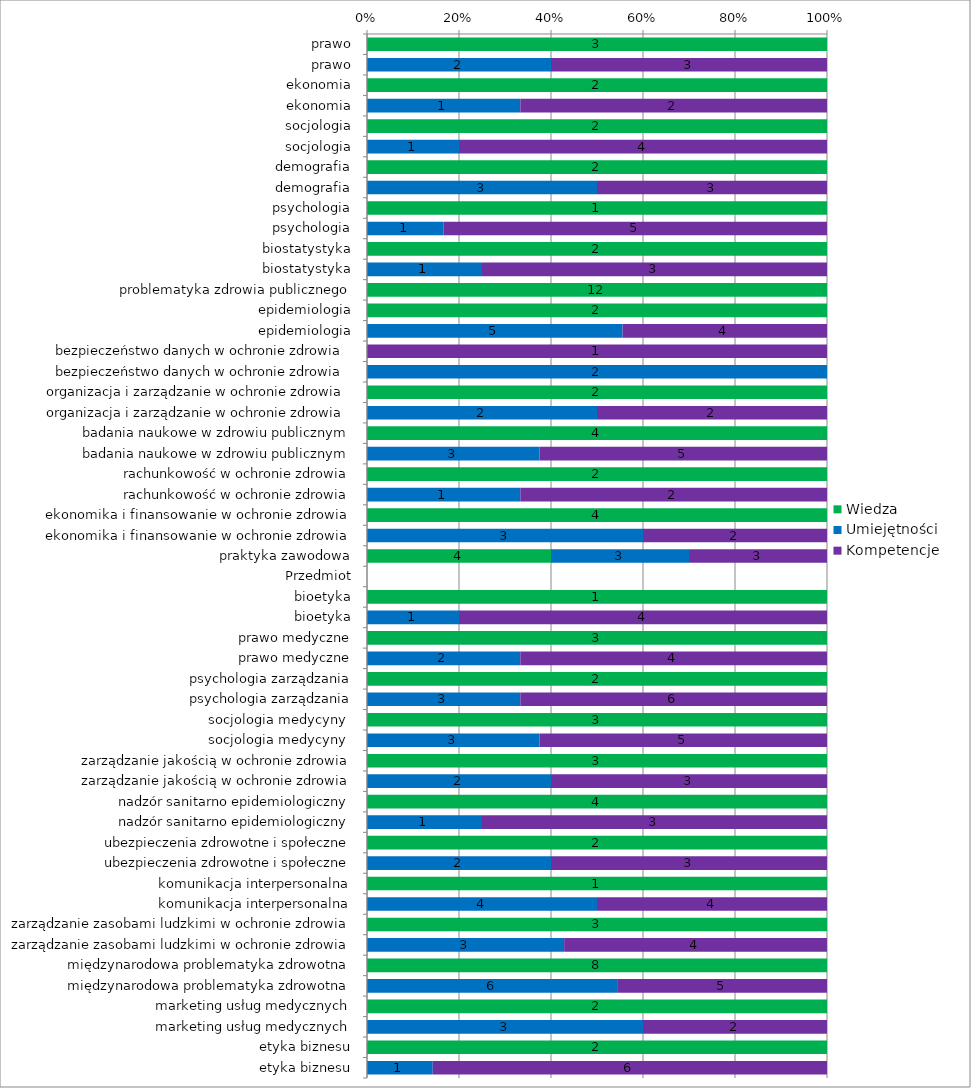
| Category | Wiedza | Umiejętności | Kompetencje |
|---|---|---|---|
|  prawo | 3 | 0 | 0 |
|  prawo | 0 | 2 | 3 |
|  ekonomia | 2 | 0 | 0 |
|  ekonomia | 0 | 1 | 2 |
|  socjologia | 2 | 0 | 0 |
|  socjologia | 0 | 1 | 4 |
|  demografia | 2 | 0 | 0 |
|  demografia | 0 | 3 | 3 |
|  psychologia | 1 | 0 | 0 |
|  psychologia | 0 | 1 | 5 |
|  biostatystyka | 2 | 0 | 0 |
|  biostatystyka | 0 | 1 | 3 |
| problematyka zdrowia publicznego | 12 | 0 | 0 |
| epidemiologia | 2 | 0 | 0 |
| epidemiologia | 0 | 5 | 4 |
| bezpieczeństwo danych w ochronie zdrowia  | 0 | 0 | 1 |
| bezpieczeństwo danych w ochronie zdrowia  | 0 | 2 | 0 |
| organizacja i zarządzanie w ochronie zdrowia  | 2 | 0 | 0 |
| organizacja i zarządzanie w ochronie zdrowia  | 0 | 2 | 2 |
| badania naukowe w zdrowiu publicznym | 4 | 0 | 0 |
| badania naukowe w zdrowiu publicznym | 0 | 3 | 5 |
| rachunkowość w ochronie zdrowia | 2 | 0 | 0 |
| rachunkowość w ochronie zdrowia | 0 | 1 | 2 |
| ekonomika i finansowanie w ochronie zdrowia | 4 | 0 | 0 |
| ekonomika i finansowanie w ochronie zdrowia | 0 | 3 | 2 |
| praktyka zawodowa | 4 | 3 | 3 |
| Przedmiot | 0 | 0 | 0 |
| bioetyka | 1 | 0 | 0 |
| bioetyka | 0 | 1 | 4 |
| prawo medyczne | 3 | 0 | 0 |
| prawo medyczne | 0 | 2 | 4 |
| psychologia zarządzania | 2 | 0 | 0 |
| psychologia zarządzania | 0 | 3 | 6 |
| socjologia medycyny  | 3 | 0 | 0 |
| socjologia medycyny  | 0 | 3 | 5 |
| zarządzanie jakością w ochronie zdrowia | 3 | 0 | 0 |
| zarządzanie jakością w ochronie zdrowia | 0 | 2 | 3 |
| nadzór sanitarno epidemiologiczny | 4 | 0 | 0 |
| nadzór sanitarno epidemiologiczny | 0 | 1 | 3 |
| ubezpieczenia zdrowotne i społeczne | 2 | 0 | 0 |
| ubezpieczenia zdrowotne i społeczne | 0 | 2 | 3 |
| komunikacja interpersonalna | 1 | 0 | 0 |
| komunikacja interpersonalna | 0 | 4 | 4 |
| zarządzanie zasobami ludzkimi w ochronie zdrowia | 3 | 0 | 0 |
| zarządzanie zasobami ludzkimi w ochronie zdrowia | 0 | 3 | 4 |
| międzynarodowa problematyka zdrowotna | 8 | 0 | 0 |
| międzynarodowa problematyka zdrowotna | 0 | 6 | 5 |
| marketing usług medycznych | 2 | 0 | 0 |
| marketing usług medycznych | 0 | 3 | 2 |
| etyka biznesu | 2 | 0 | 0 |
| etyka biznesu | 0 | 1 | 6 |